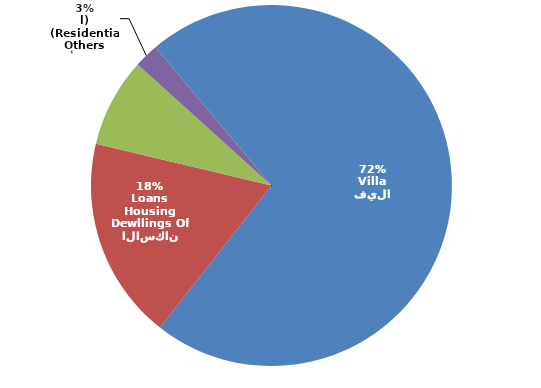
| Category | Series 0 |
|---|---|
| فيلا
Villa | 2680 |
| مساكن قروض الاسكان
Dewllings Of Housing Loans | 677 |
| عمارة
Multi-Storeyed Building | 298 |
| أخرى
Others (Residential) | 82 |